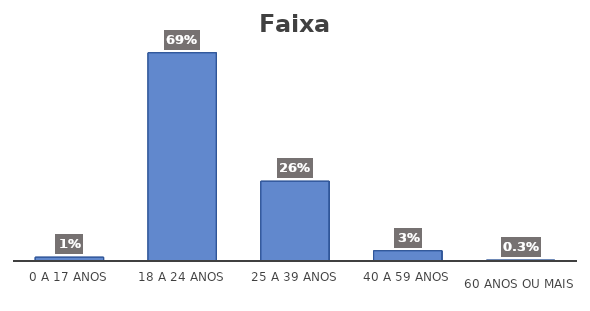
| Category | Series 0 |
|---|---|
| 0 a 17 anos | 0.012 |
| 18 a 24 anos | 0.688 |
| 25 a 39 anos | 0.263 |
| 40 a 59 anos | 0.034 |
| 60 anos ou mais | 0.003 |